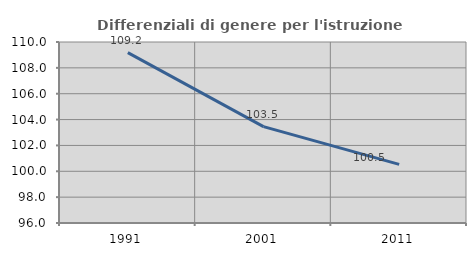
| Category | Differenziali di genere per l'istruzione superiore |
|---|---|
| 1991.0 | 109.176 |
| 2001.0 | 103.459 |
| 2011.0 | 100.533 |